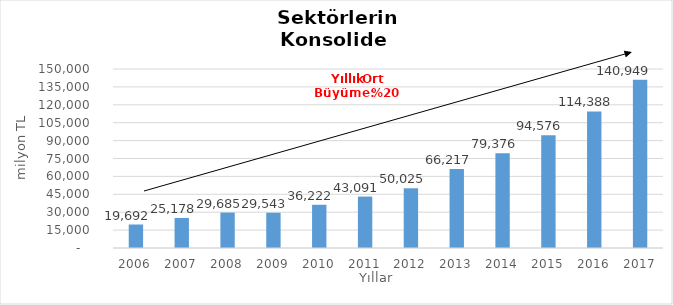
| Category | Toplam |
|---|---|
| 2006.0 | 19691.807 |
| 2007.0 | 25178.471 |
| 2008.0 | 29685 |
| 2009.0 | 29543.192 |
| 2010.0 | 36222.019 |
| 2011.0 | 43090.622 |
| 2012.0 | 50025.409 |
| 2013.0 | 66217.364 |
| 2014.0 | 79376 |
| 2015.0 | 94576 |
| 2016.0 | 114388 |
| 2017.0 | 140949 |